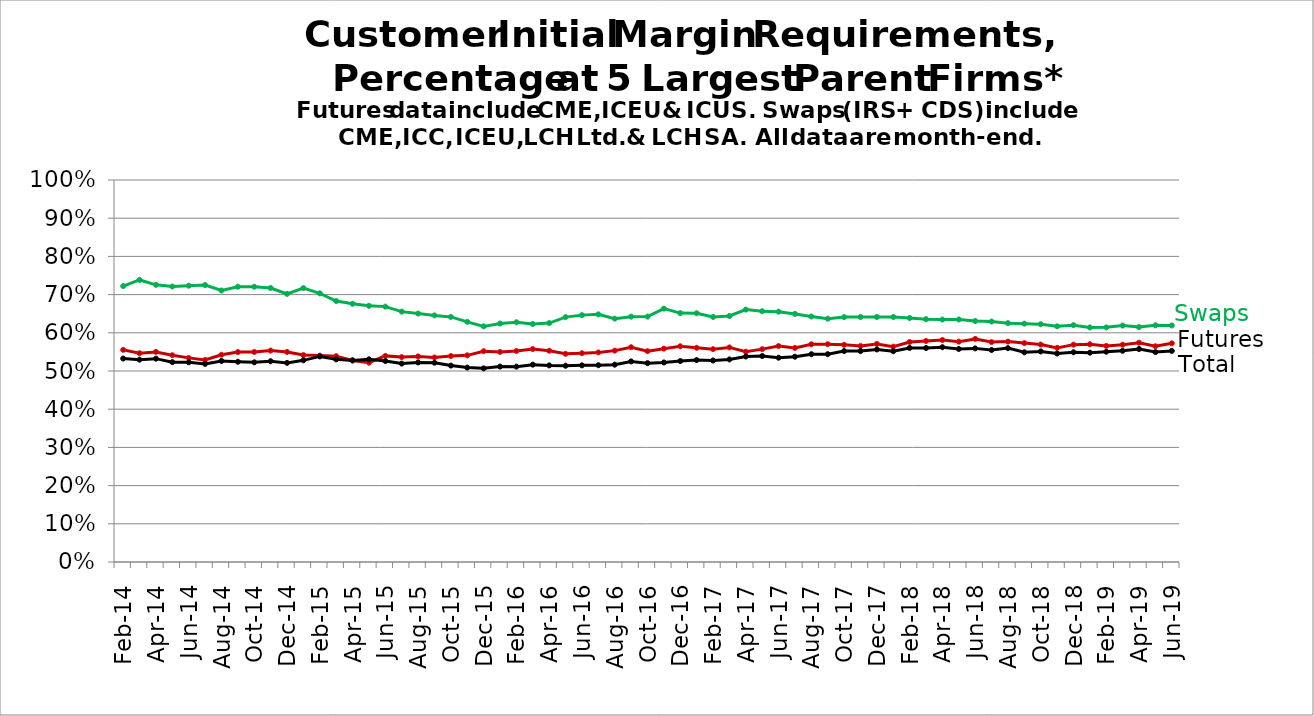
| Category | Futures | Swaps | Total | Series 8 | Series 9 |
|---|---|---|---|---|---|
| 2014-02-28 |  |  |  |  |  |
| nan |  |  |  |  |  |
| 2014-04-30 |  |  |  |  |  |
| nan |  |  |  |  |  |
| 2014-06-30 |  |  |  |  |  |
| nan |  |  |  |  |  |
| 2014-08-29 |  |  |  |  |  |
| nan |  |  |  |  |  |
| 2014-10-31 |  |  |  |  |  |
| nan |  |  |  |  |  |
| 2014-12-31 |  |  |  |  |  |
| nan |  |  |  |  |  |
| 2015-02-27 |  |  |  |  |  |
| nan |  |  |  |  |  |
| 2015-04-30 |  |  |  |  |  |
| nan |  |  |  |  |  |
| 2015-06-30 |  |  |  |  |  |
| nan |  |  |  |  |  |
| 2015-08-31 |  |  |  |  |  |
| nan |  |  |  |  |  |
| 2015-10-30 |  |  |  |  |  |
| nan |  |  |  |  |  |
| 2015-12-31 |  |  |  |  |  |
| nan |  |  |  |  |  |
| 2016-02-29 |  |  |  |  |  |
| nan |  |  |  |  |  |
| 2016-04-29 |  |  |  |  |  |
| nan |  |  |  |  |  |
| 2016-06-30 |  |  |  |  |  |
| nan |  |  |  |  |  |
| 2016-08-31 |  |  |  |  |  |
| nan |  |  |  |  |  |
| 2016-10-31 |  |  |  |  |  |
| nan |  |  |  |  |  |
| 2016-12-30 |  |  |  |  |  |
| nan |  |  |  |  |  |
| 2017-02-28 |  |  |  |  |  |
| nan |  |  |  |  |  |
| 2017-04-28 |  |  |  |  |  |
| nan |  |  |  |  |  |
| 2017-06-30 |  |  |  |  |  |
| nan |  |  |  |  |  |
| 2017-08-31 |  |  |  |  |  |
| nan |  |  |  |  |  |
| 2017-10-31 |  |  |  |  |  |
| nan |  |  |  |  |  |
| 2017-12-29 |  |  |  |  |  |
| nan |  |  |  |  |  |
| 2018-02-28 |  |  |  |  |  |
| nan |  |  |  |  |  |
| 2018-04-30 |  |  |  |  |  |
| nan |  |  |  |  |  |
| 2018-06-29 |  |  |  |  |  |
| nan |  |  |  |  |  |
| 2018-08-31 |  |  |  |  |  |
| nan |  |  |  |  |  |
| 2018-10-31 |  |  |  |  |  |
| nan |  |  |  |  |  |
| 2018-12-31 |  |  |  |  |  |
| nan |  |  |  |  |  |
| 2019-02-28 |  |  |  |  |  |
| nan |  |  |  |  |  |
| 2019-04-30 |  |  |  |  |  |
| nan |  |  |  |  |  |
| 2019-06-28 |  |  |  |  |  |